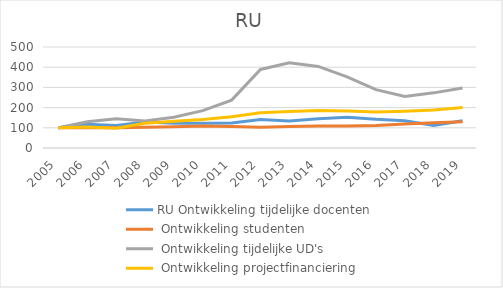
| Category | RU |
|---|---|
| 2005.0 | 100 |
| 2006.0 | 104.142 |
| 2007.0 | 97.362 |
| 2008.0 | 122.761 |
| 2009.0 | 132.223 |
| 2010.0 | 140.979 |
| 2011.0 | 154.957 |
| 2012.0 | 174.81 |
| 2013.0 | 181.234 |
| 2014.0 | 185.609 |
| 2015.0 | 183.644 |
| 2016.0 | 178.73 |
| 2017.0 | 181.967 |
| 2018.0 | 187.63 |
| 2019.0 | 200.741 |